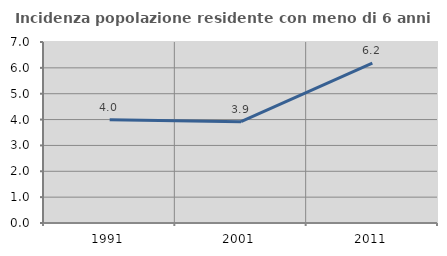
| Category | Incidenza popolazione residente con meno di 6 anni |
|---|---|
| 1991.0 | 3.996 |
| 2001.0 | 3.918 |
| 2011.0 | 6.188 |